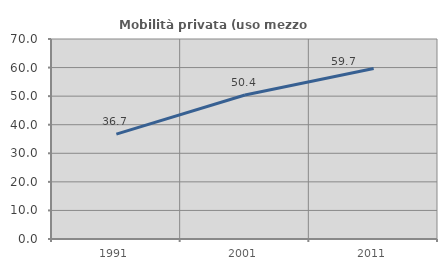
| Category | Mobilità privata (uso mezzo privato) |
|---|---|
| 1991.0 | 36.707 |
| 2001.0 | 50.419 |
| 2011.0 | 59.686 |